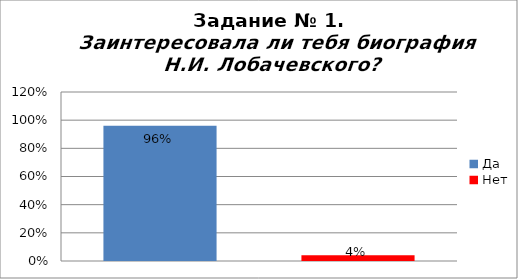
| Category | Заинтересовала ли тебя биография Н.И. Лобачевского? |
|---|---|
| Да | 0.96 |
| Нет | 0.04 |